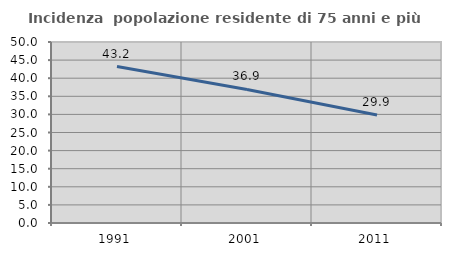
| Category | Incidenza  popolazione residente di 75 anni e più |
|---|---|
| 1991.0 | 43.22 |
| 2001.0 | 36.905 |
| 2011.0 | 29.851 |